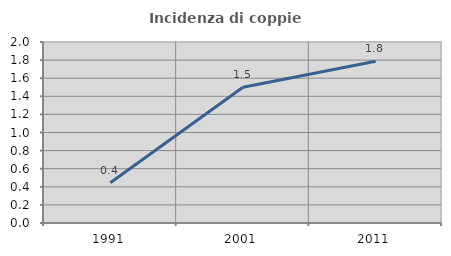
| Category | Incidenza di coppie miste |
|---|---|
| 1991.0 | 0.444 |
| 2001.0 | 1.5 |
| 2011.0 | 1.787 |